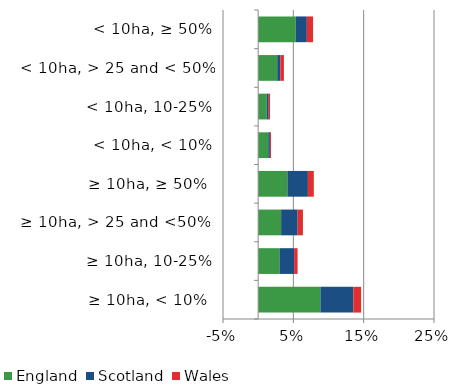
| Category | England | Scotland | Wales |
|---|---|---|---|
|  ≥ 10ha, < 10%  | 0.088 | 0.047 | 0.011 |
|   ≥ 10ha, 10-25% | 0.03 | 0.021 | 0.005 |
|   ≥ 10ha, > 25 and <50%  | 0.033 | 0.023 | 0.008 |
|   ≥ 10ha, ≥ 50%  | 0.042 | 0.029 | 0.008 |
|  < 10ha, < 10% | 0.014 | 0.002 | 0.002 |
|  < 10ha, 10-25% | 0.012 | 0.003 | 0.002 |
|  < 10ha, > 25 and < 50% | 0.027 | 0.004 | 0.005 |
|  < 10ha, ≥ 50% | 0.053 | 0.016 | 0.009 |